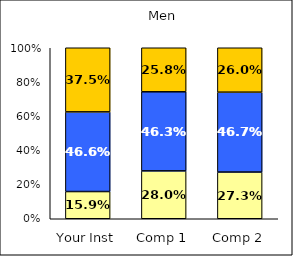
| Category | Low Academic Adjustment | Average Academic Adjustment | High Academic Adjustment |
|---|---|---|---|
| Your Inst | 0.159 | 0.466 | 0.375 |
| Comp 1 | 0.28 | 0.463 | 0.258 |
| Comp 2 | 0.273 | 0.467 | 0.26 |